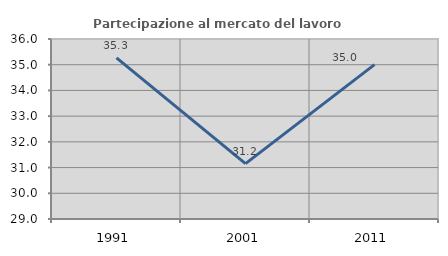
| Category | Partecipazione al mercato del lavoro  femminile |
|---|---|
| 1991.0 | 35.268 |
| 2001.0 | 31.156 |
| 2011.0 | 35.005 |